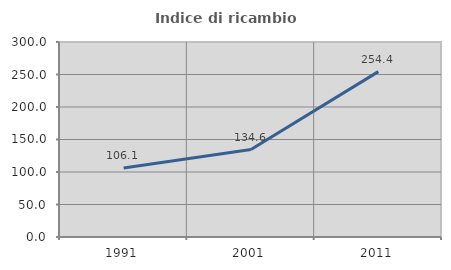
| Category | Indice di ricambio occupazionale  |
|---|---|
| 1991.0 | 106.084 |
| 2001.0 | 134.595 |
| 2011.0 | 254.386 |